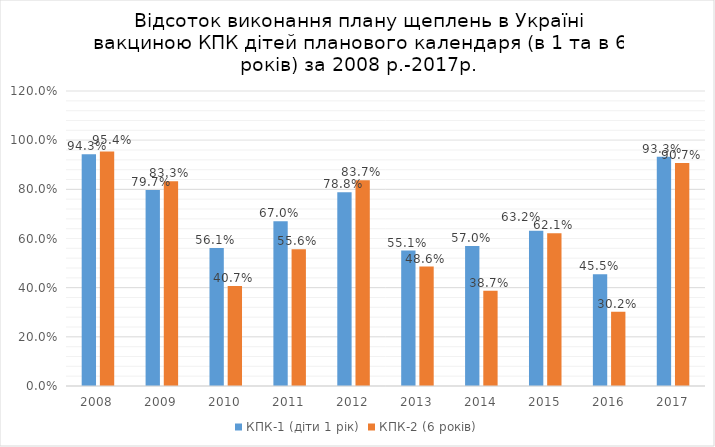
| Category | КПК-1 (діти 1 рік) | КПК-2 (6 років) |
|---|---|---|
| 2008 | 0.943 | 0.954 |
| 2009 | 0.797 | 0.833 |
| 2010 | 0.561 | 0.407 |
| 2011 | 0.67 | 0.556 |
| 2012 | 0.788 | 0.837 |
| 2013 | 0.551 | 0.486 |
| 2014 | 0.57 | 0.387 |
| 2015 | 0.632 | 0.621 |
| 2016 | 0.455 | 0.302 |
| 2017 | 0.933 | 0.907 |